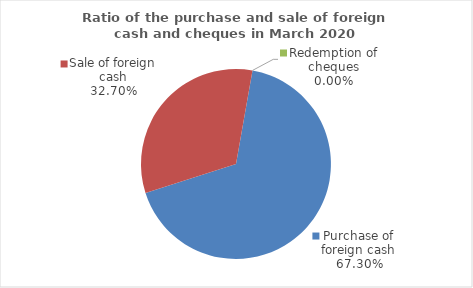
| Category | Series 0 |
|---|---|
| Purchase of foreign cash | 67.299 |
| Sale of foreign cash | 32.701 |
| Redemption of cheques | 0 |